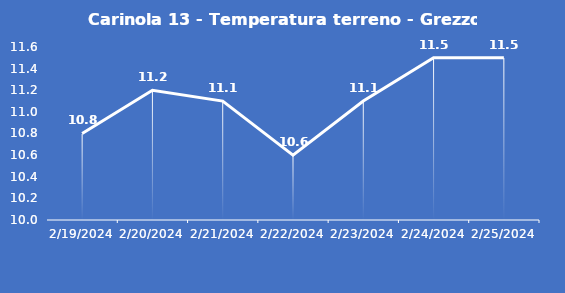
| Category | Carinola 13 - Temperatura terreno - Grezzo (°C) |
|---|---|
| 2/19/24 | 10.8 |
| 2/20/24 | 11.2 |
| 2/21/24 | 11.1 |
| 2/22/24 | 10.6 |
| 2/23/24 | 11.1 |
| 2/24/24 | 11.5 |
| 2/25/24 | 11.5 |